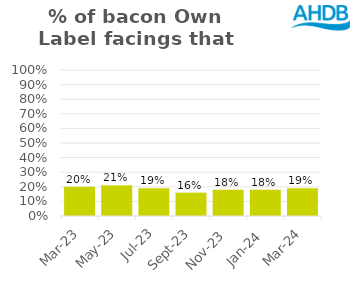
| Category | Bacon |
|---|---|
| 2023-03-01 | 0.2 |
| 2023-05-01 | 0.21 |
| 2023-07-01 | 0.19 |
| 2023-09-01 | 0.16 |
| 2023-11-01 | 0.18 |
| 2024-01-01 | 0.18 |
| 2024-03-01 | 0.19 |